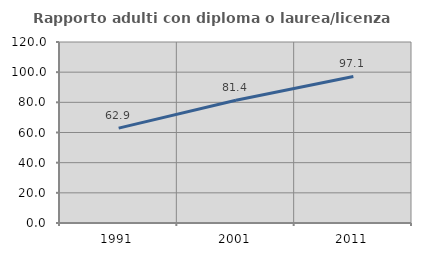
| Category | Rapporto adulti con diploma o laurea/licenza media  |
|---|---|
| 1991.0 | 62.889 |
| 2001.0 | 81.408 |
| 2011.0 | 97.143 |